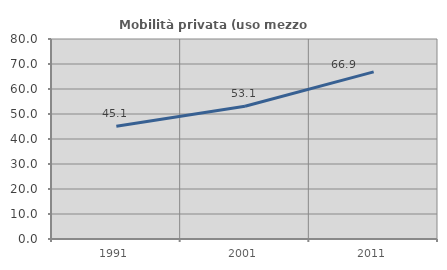
| Category | Mobilità privata (uso mezzo privato) |
|---|---|
| 1991.0 | 45.138 |
| 2001.0 | 53.125 |
| 2011.0 | 66.862 |